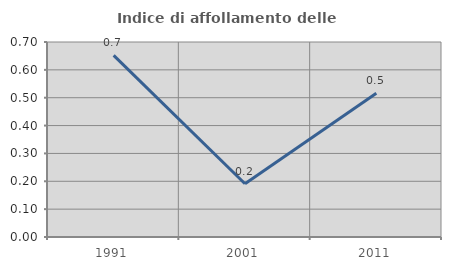
| Category | Indice di affollamento delle abitazioni  |
|---|---|
| 1991.0 | 0.652 |
| 2001.0 | 0.191 |
| 2011.0 | 0.516 |